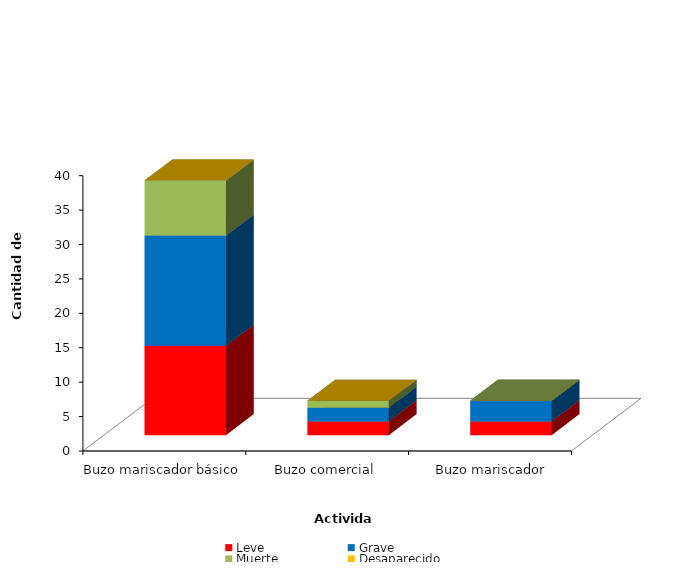
| Category | Leve | Grave | Muerte | Desaparecido |
|---|---|---|---|---|
| Buzo mariscador básico | 13 | 16 | 8 | 0 |
| Buzo comercial | 2 | 2 | 1 | 0 |
| Buzo mariscador intermedio | 2 | 3 | 0 | 0 |